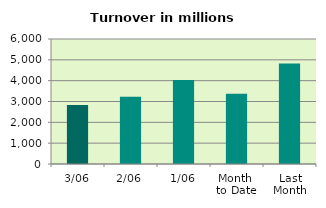
| Category | Series 0 |
|---|---|
| 3/06 | 2832.711 |
| 2/06 | 3232.911 |
| 1/06 | 4037.212 |
| Month 
to Date | 3367.611 |
| Last
Month | 4818.103 |